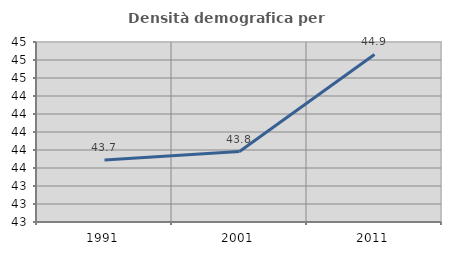
| Category | Densità demografica |
|---|---|
| 1991.0 | 43.689 |
| 2001.0 | 43.783 |
| 2011.0 | 44.861 |